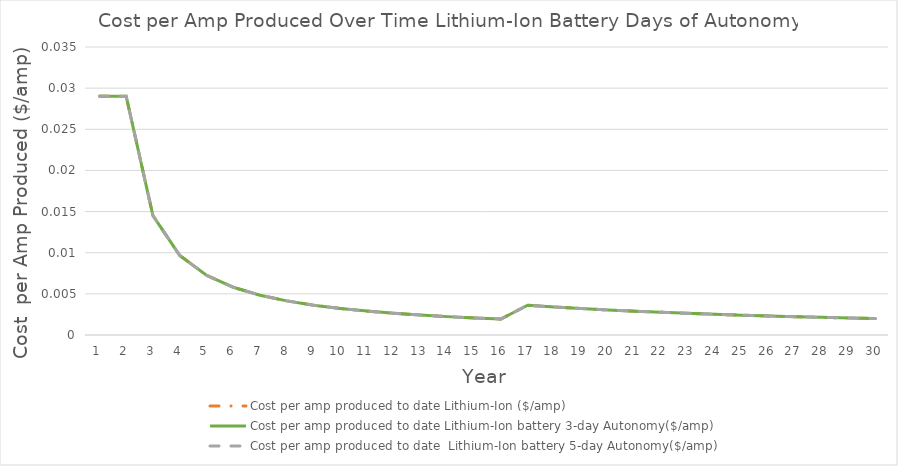
| Category | Cost per amp produced to date Lithium-Ion ($/amp) | Cost per amp produced to date Lithium-Ion battery 3-day Autonomy($/amp) | Cost per amp produced to date  Lithium-Ion battery 5-day Autonomy($/amp) |
|---|---|---|---|
| 0 | 0.029 | 0.029 | 0.029 |
| 1 | 0.029 | 0.029 | 0.029 |
| 2 | 0.015 | 0.015 | 0.015 |
| 3 | 0.01 | 0.01 | 0.01 |
| 4 | 0.007 | 0.007 | 0.007 |
| 5 | 0.006 | 0.006 | 0.006 |
| 6 | 0.005 | 0.005 | 0.005 |
| 7 | 0.004 | 0.004 | 0.004 |
| 8 | 0.004 | 0.004 | 0.004 |
| 9 | 0.003 | 0.003 | 0.003 |
| 10 | 0.003 | 0.003 | 0.003 |
| 11 | 0.003 | 0.003 | 0.003 |
| 12 | 0.002 | 0.002 | 0.002 |
| 13 | 0.002 | 0.002 | 0.002 |
| 14 | 0.002 | 0.002 | 0.002 |
| 15 | 0.002 | 0.002 | 0.002 |
| 16 | 0.004 | 0.004 | 0.004 |
| 17 | 0.003 | 0.003 | 0.003 |
| 18 | 0.003 | 0.003 | 0.003 |
| 19 | 0.003 | 0.003 | 0.003 |
| 20 | 0.003 | 0.003 | 0.003 |
| 21 | 0.003 | 0.003 | 0.003 |
| 22 | 0.003 | 0.003 | 0.003 |
| 23 | 0.003 | 0.003 | 0.003 |
| 24 | 0.002 | 0.002 | 0.002 |
| 25 | 0.002 | 0.002 | 0.002 |
| 26 | 0.002 | 0.002 | 0.002 |
| 27 | 0.002 | 0.002 | 0.002 |
| 28 | 0.002 | 0.002 | 0.002 |
| 29 | 0.002 | 0.002 | 0.002 |